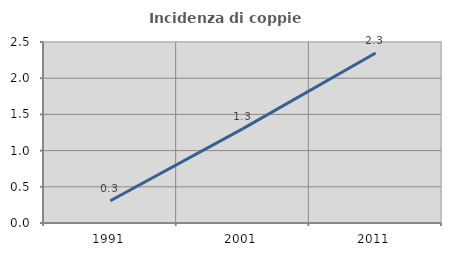
| Category | Incidenza di coppie miste |
|---|---|
| 1991.0 | 0.307 |
| 2001.0 | 1.304 |
| 2011.0 | 2.348 |